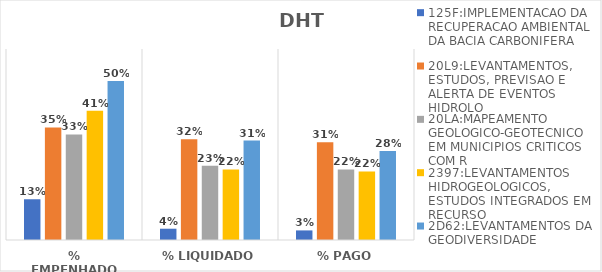
| Category | 125F:IMPLEMENTACAO DA RECUPERACAO AMBIENTAL DA BACIA CARBONIFERA | 20L9:LEVANTAMENTOS, ESTUDOS, PREVISAO E ALERTA DE EVENTOS HIDROLO | 20LA:MAPEAMENTO GEOLOGICO-GEOTECNICO EM MUNICIPIOS CRITICOS COM R | 2397:LEVANTAMENTOS HIDROGEOLOGICOS, ESTUDOS INTEGRADOS EM RECURSO | 2D62:LEVANTAMENTOS DA GEODIVERSIDADE |
|---|---|---|---|---|---|
| % EMPENHADO | 0.128 | 0.354 | 0.332 | 0.406 | 0.499 |
| % LIQUIDADO | 0.035 | 0.316 | 0.233 | 0.221 | 0.313 |
| % PAGO | 0.03 | 0.307 | 0.222 | 0.215 | 0.28 |